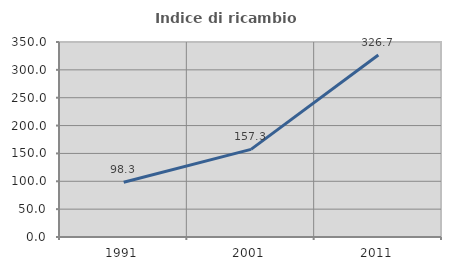
| Category | Indice di ricambio occupazionale  |
|---|---|
| 1991.0 | 98.319 |
| 2001.0 | 157.292 |
| 2011.0 | 326.667 |